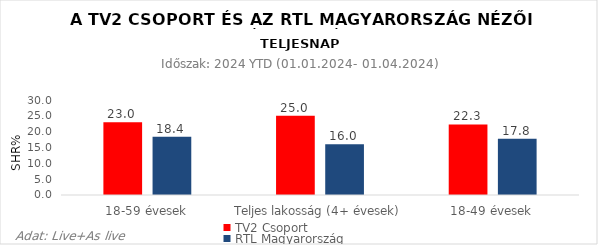
| Category | TV2 Csoport | RTL Magyarország |
|---|---|---|
| 18-59 évesek | 23 | 18.4 |
| Teljes lakosság (4+ évesek) | 25 | 16 |
| 18-49 évesek | 22.3 | 17.8 |